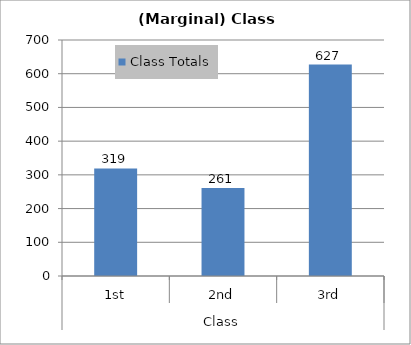
| Category | Class Totals |
|---|---|
| 0 | 319 |
| 1 | 261 |
| 2 | 627 |